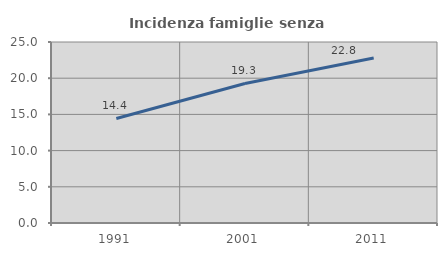
| Category | Incidenza famiglie senza nuclei |
|---|---|
| 1991.0 | 14.44 |
| 2001.0 | 19.274 |
| 2011.0 | 22.795 |